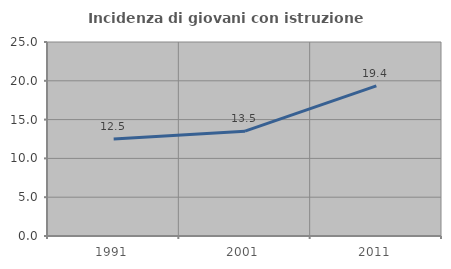
| Category | Incidenza di giovani con istruzione universitaria |
|---|---|
| 1991.0 | 12.5 |
| 2001.0 | 13.514 |
| 2011.0 | 19.355 |